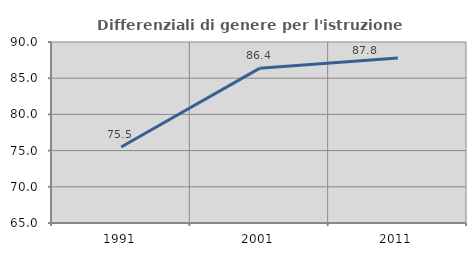
| Category | Differenziali di genere per l'istruzione superiore |
|---|---|
| 1991.0 | 75.493 |
| 2001.0 | 86.36 |
| 2011.0 | 87.79 |